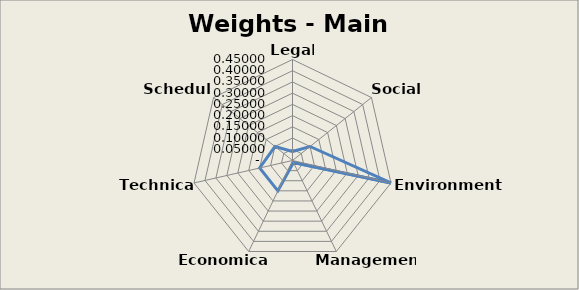
| Category | Series 0 |
|---|---|
| Legal | 0.04 |
| Social | 0.1 |
| Environmental | 0.45 |
| Management | 0.01 |
| Economical | 0.15 |
| Technical | 0.15 |
| Schedule | 0.1 |